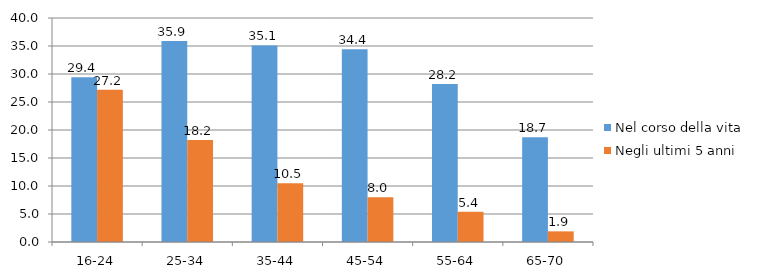
| Category | Nel corso della vita | Negli ultimi 5 anni  |
|---|---|---|
| 16-24 | 29.4 | 27.2 |
| 25-34 | 35.9 | 18.2 |
| 35-44 | 35.1 | 10.5 |
| 45-54 | 34.4 | 8 |
| 55-64 | 28.2 | 5.4 |
| 65-70 | 18.7 | 1.9 |